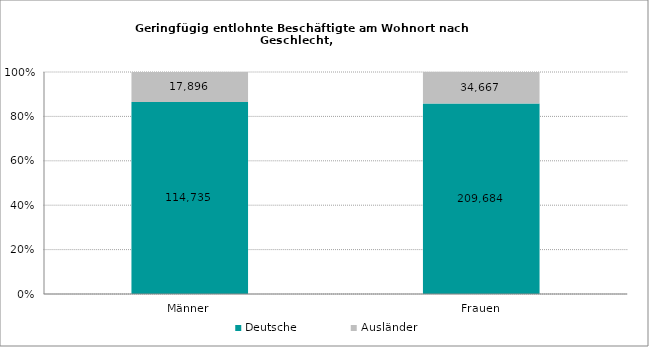
| Category | Deutsche | Ausländer |
|---|---|---|
| Männer | 114735 | 17896 |
| Frauen | 209684 | 34667 |